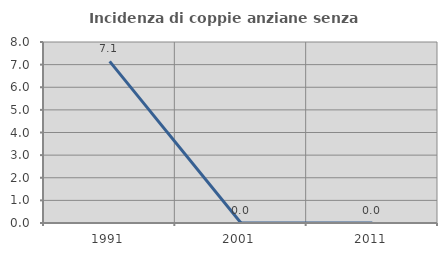
| Category | Incidenza di coppie anziane senza figli  |
|---|---|
| 1991.0 | 7.143 |
| 2001.0 | 0 |
| 2011.0 | 0 |